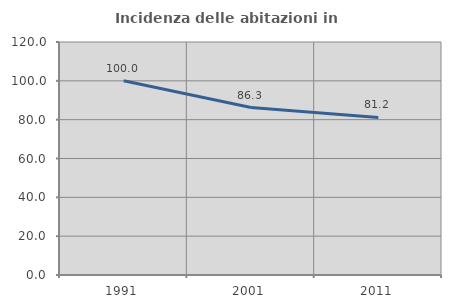
| Category | Incidenza delle abitazioni in proprietà  |
|---|---|
| 1991.0 | 100 |
| 2001.0 | 86.26 |
| 2011.0 | 81.159 |